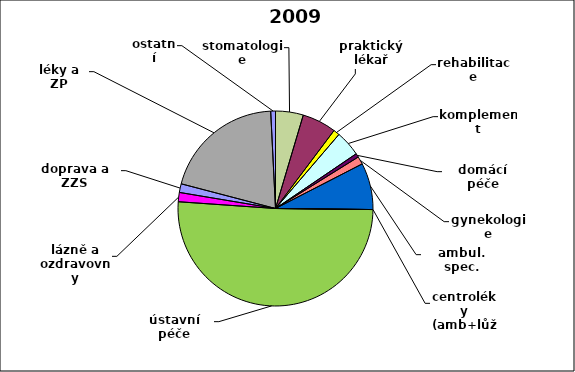
| Category | Series 0 |
|---|---|
| stomatologie | 0.046 |
| praktický lékař | 0.056 |
| rehabilitace | 0.01 |
| komplement | 0.042 |
| domácí péče | 0.006 |
| gynekologie | 0.013 |
| ambul. spec. | 0.077 |
| centroléky (amb+lůž) | 0 |
| ústavní péče | 0.509 |
| lázně a ozdravovny | 0.015 |
| doprava a ZZS | 0.014 |
| léky a ZP | 0.201 |
| ostatní | 0.008 |